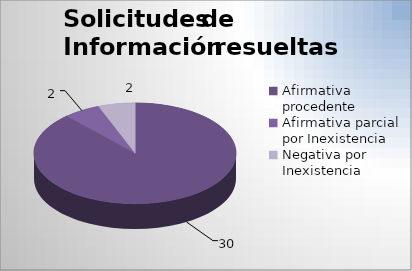
| Category | Series 0 |
|---|---|
| Afirmativa procedente  | 30 |
| Afirmativa parcial por Inexistencia  | 2 |
| Negativa por Inexistencia | 2 |